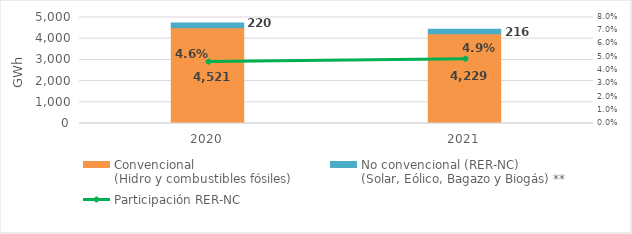
| Category | Convencional
(Hidro y combustibles fósiles) | No convencional (RER-NC)
(Solar, Eólico, Bagazo y Biogás) ** |
|---|---|---|
| 2020.0 | 4520.879 | 219.589 |
| 2021.0 | 4228.951 | 215.601 |